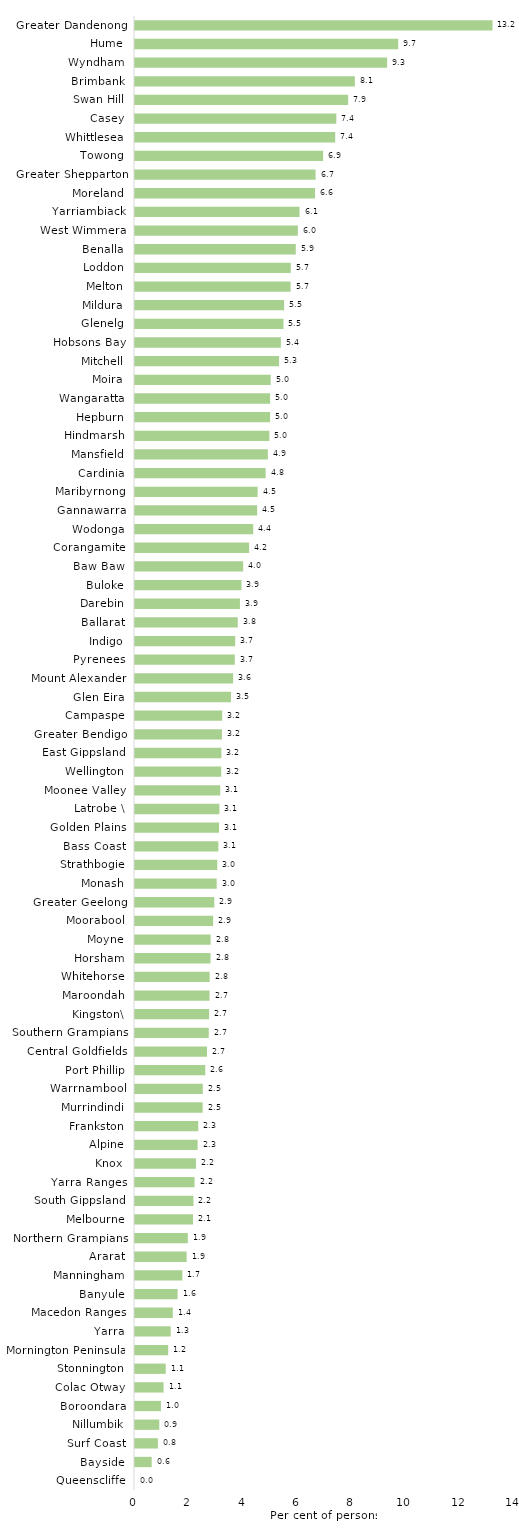
| Category | Series 0 |
|---|---|
| Queenscliffe | 0 |
| Bayside | 0.615 |
| Surf Coast | 0.843 |
| Nillumbik | 0.895 |
| Boroondara | 0.954 |
| Colac Otway | 1.053 |
| Stonnington | 1.132 |
| Mornington Peninsula | 1.224 |
| Yarra | 1.315 |
| Macedon Ranges | 1.393 |
| Banyule | 1.569 |
| Manningham | 1.746 |
| Ararat | 1.901 |
| Northern Grampians | 1.946 |
| Melbourne | 2.136 |
| South Gippsland | 2.153 |
| Yarra Ranges | 2.194 |
| Knox | 2.247 |
| Alpine | 2.308 |
| Frankston | 2.33 |
| Murrindindi | 2.491 |
| Warrnambool | 2.497 |
| Port Phillip | 2.589 |
| Central Goldfields | 2.652 |
| Southern Grampians | 2.717 |
| Kingston\ | 2.728 |
| Maroondah | 2.745 |
| Whitehorse | 2.751 |
| Horsham | 2.783 |
| Moyne | 2.786 |
| Moorabool | 2.878 |
| Greater Geelong | 2.921 |
| Monash | 3.009 |
| Strathbogie | 3.03 |
| Bass Coast | 3.07 |
| Golden Plains | 3.095 |
| Latrobe \ | 3.11 |
| Moonee Valley | 3.141 |
| Wellington | 3.178 |
| East Gippsland | 3.182 |
| Greater Bendigo | 3.203 |
| Campaspe | 3.212 |
| Glen Eira | 3.536 |
| Mount Alexander | 3.614 |
| Pyrenees | 3.676 |
| Indigo | 3.691 |
| Ballarat | 3.786 |
| Darebin | 3.866 |
| Buloke | 3.922 |
| Baw Baw | 3.986 |
| Corangamite | 4.204 |
| Wodonga | 4.355 |
| Gannawarra | 4.5 |
| Maribyrnong | 4.517 |
| Cardinia | 4.812 |
| Mansfield | 4.895 |
| Hindmarsh | 4.95 |
| Hepburn | 4.977 |
| Wangaratta | 4.977 |
| Moira | 5 |
| Mitchell | 5.308 |
| Hobsons Bay | 5.374 |
| Glenelg | 5.469 |
| Mildura | 5.494 |
| Melton | 5.732 |
| Loddon | 5.738 |
| Benalla | 5.923 |
| West Wimmera | 6 |
| Yarriambiack | 6.061 |
| Moreland | 6.633 |
| Greater Shepparton | 6.652 |
| Towong | 6.931 |
| Whittlesea | 7.376 |
| Casey | 7.417 |
| Swan Hill | 7.853 |
| Brimbank | 8.1 |
| Wyndham | 9.289 |
| Hume | 9.697 |
| Greater Dandenong | 13.171 |